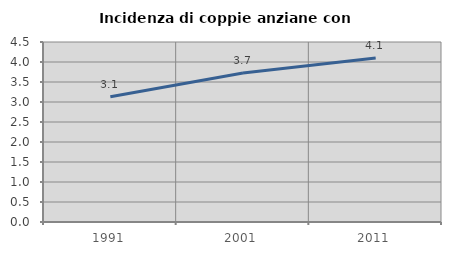
| Category | Incidenza di coppie anziane con figli |
|---|---|
| 1991.0 | 3.132 |
| 2001.0 | 3.726 |
| 2011.0 | 4.1 |